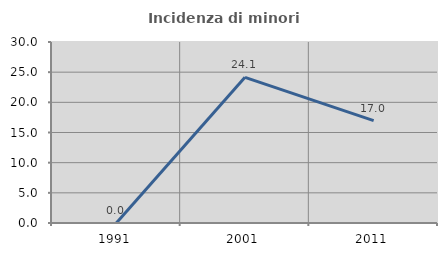
| Category | Incidenza di minori stranieri |
|---|---|
| 1991.0 | 0 |
| 2001.0 | 24.138 |
| 2011.0 | 16.959 |